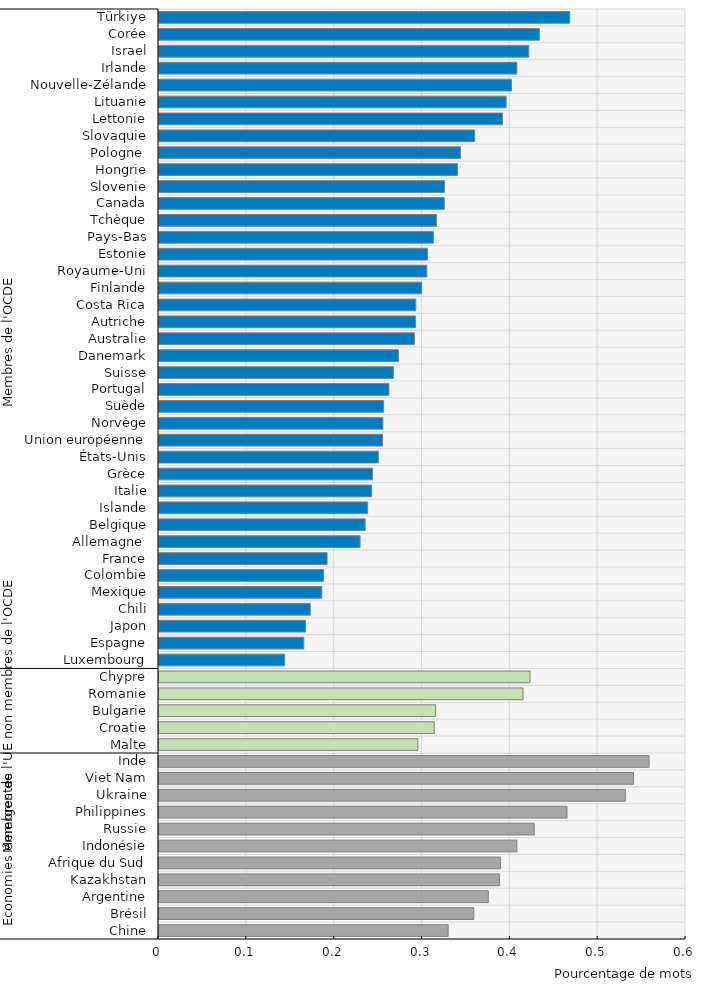
| Category | % agriculture |
|---|---|
| 0 | 0.329 |
| 1 | 0.358 |
| 2 | 0.375 |
| 3 | 0.388 |
| 4 | 0.389 |
| 5 | 0.407 |
| 6 | 0.427 |
| 7 | 0.465 |
| 8 | 0.531 |
| 9 | 0.54 |
| 10 | 0.558 |
| 11 | 0.295 |
| 12 | 0.313 |
| 13 | 0.315 |
| 14 | 0.414 |
| 15 | 0.422 |
| 16 | 0.143 |
| 17 | 0.165 |
| 18 | 0.167 |
| 19 | 0.172 |
| 20 | 0.185 |
| 21 | 0.187 |
| 22 | 0.191 |
| 23 | 0.229 |
| 24 | 0.235 |
| 25 | 0.238 |
| 26 | 0.242 |
| 27 | 0.243 |
| 28 | 0.25 |
| 29 | 0.255 |
| 30 | 0.255 |
| 31 | 0.256 |
| 32 | 0.262 |
| 33 | 0.267 |
| 34 | 0.273 |
| 35 | 0.291 |
| 36 | 0.292 |
| 37 | 0.292 |
| 38 | 0.299 |
| 39 | 0.305 |
| 40 | 0.306 |
| 41 | 0.312 |
| 42 | 0.316 |
| 43 | 0.325 |
| 44 | 0.325 |
| 45 | 0.34 |
| 46 | 0.343 |
| 47 | 0.359 |
| 48 | 0.391 |
| 49 | 0.395 |
| 50 | 0.401 |
| 51 | 0.407 |
| 52 | 0.421 |
| 53 | 0.433 |
| 54 | 0.468 |